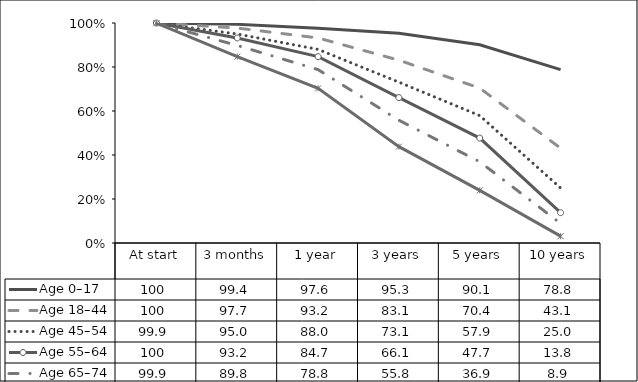
| Category | Age 0–17 | Age 18–44  | Age 45–54  | Age 55–64  | Age 65–74  | Age 75+  |
|---|---|---|---|---|---|---|
| At start | 100 | 100 | 99.9 | 100 | 99.9 | 99.9 |
| 3 months | 99.4 | 97.7 | 95 | 93.2 | 89.8 | 84.7 |
| 1 year | 97.6 | 93.2 | 88 | 84.7 | 78.8 | 70.3 |
| 3 years | 95.3 | 83.1 | 73.1 | 66.1 | 55.8 | 43.8 |
| 5 years | 90.1 | 70.4 | 57.9 | 47.7 | 36.9 | 23.9 |
| 10 years | 78.8 | 43.1 | 25 | 13.8 | 8.9 | 3.1 |